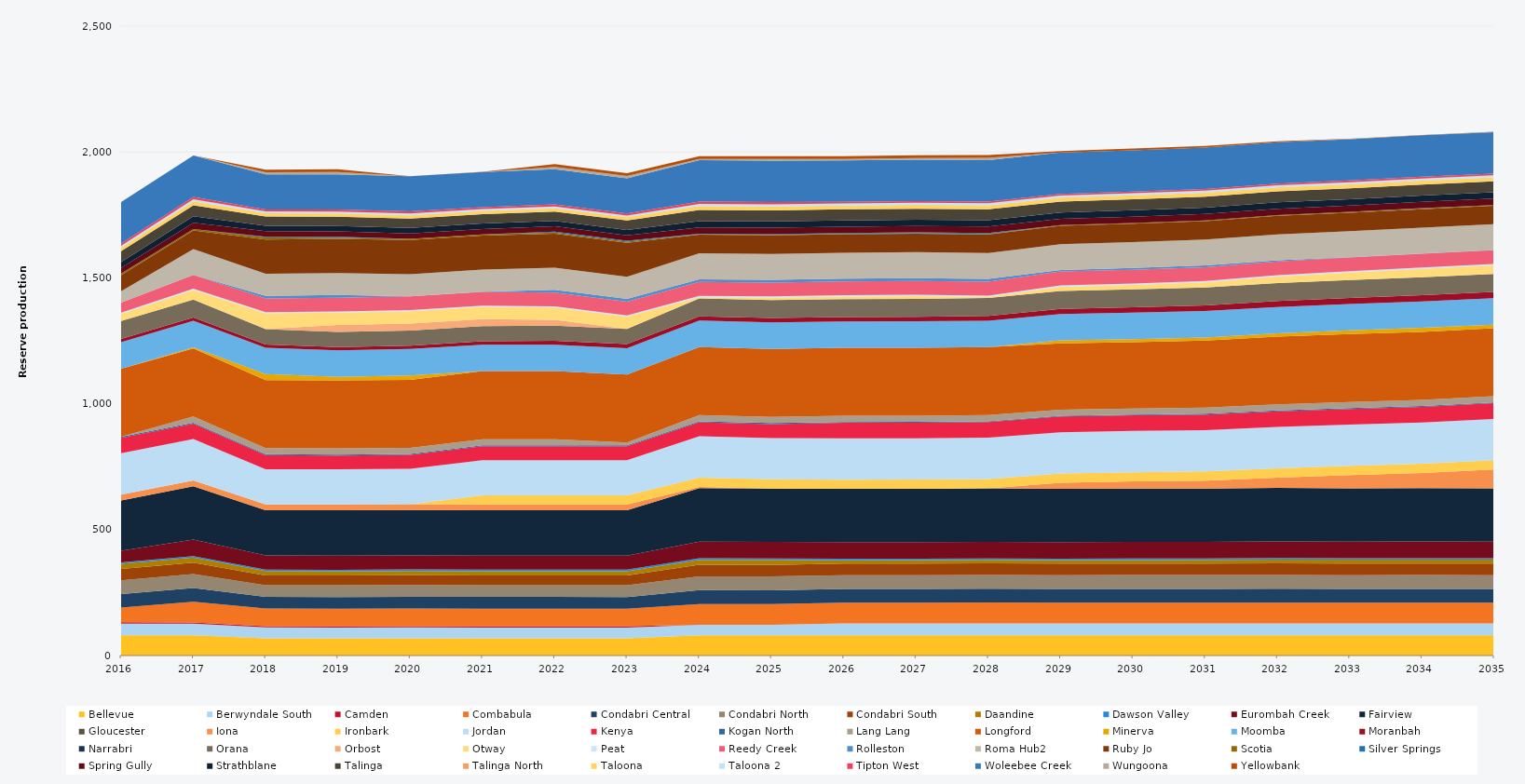
| Category | Bellevue | Berwyndale South | Camden | Combabula | Condabri Central | Condabri North | Condabri South | Daandine | Dawson Valley | Eurombah Creek | Fairview | Gloucester | Iona | Ironbark | Jordan | Kenya | Kogan North | Lang Lang | Longford | Minerva | Moomba | Moranbah | Narrabri | Orana | Orbost | Otway | Peat | Reedy Creek | Rolleston | Roma Hub2 | Ruby Jo | Scotia | Silver Springs | Spring Gully | Strathblane | Talinga | Talinga North | Taloona | Taloona 2 | Tipton West | Woleebee Creek | Wungoona | Yellowbank |
|---|---|---|---|---|---|---|---|---|---|---|---|---|---|---|---|---|---|---|---|---|---|---|---|---|---|---|---|---|---|---|---|---|---|---|---|---|---|---|---|---|---|---|---|
| 2016 | 80.52 | 46.378 | 5 | 58.608 | 54.013 | 54.488 | 44.939 | 20.13 | 5.856 | 46.503 | 199.247 | 0 | 23.12 | 0 | 164.7 | 61.402 | 4.392 | 0 | 270 | 0 | 105 | 12.867 | 0 | 71.092 | 0 | 28.323 | 5.49 | 39.406 | 0 | 45.298 | 64.114 | 6.001 | 0 | 22.72 | 23.178 | 43.205 | 0 | 13.509 | 7.577 | 9.516 | 164.7 | 0 | 0 |
| 2017 | 80.3 | 46.254 | 5 | 82.125 | 54.75 | 54.75 | 45.625 | 20.075 | 5.84 | 65.7 | 211.7 | 0 | 23.12 | 0 | 164.25 | 60.961 | 4.38 | 24.455 | 270 | 5.142 | 105 | 12.873 | 0 | 71.175 | 0 | 38 | 5.475 | 54.75 | 0 | 102.93 | 73.702 | 5.652 | 0 | 25.185 | 25.185 | 43.8 | 0 | 15.33 | 8.395 | 9.49 | 164.25 | 0 | 0 |
| 2018 | 68.255 | 43.435 | 5 | 69.806 | 46.538 | 46.538 | 38.781 | 17.064 | 5.84 | 55.845 | 179.945 | 0 | 23.12 | 0 | 139.612 | 55.845 | 3.723 | 24.455 | 270 | 23.725 | 105 | 13.04 | 0 | 60.499 | 1.143 | 61.725 | 4.654 | 54.75 | 10.41 | 87.49 | 135.659 | 8.582 | 3.149 | 21.407 | 21.407 | 37.23 | 0 | 13.031 | 7.136 | 8.066 | 139.612 | 8.046 | 10.279 |
| 2019 | 68.255 | 42.865 | 5 | 69.806 | 46.538 | 46.538 | 38.781 | 17.064 | 5.84 | 55.845 | 179.945 | 0 | 23.12 | 0 | 139.612 | 55.386 | 3.723 | 24.455 | 270 | 14.204 | 105 | 12.81 | 0 | 60.499 | 27.28 | 48.95 | 4.654 | 54.75 | 10.95 | 87.49 | 135.454 | 4.429 | 3.723 | 21.407 | 21.407 | 37.23 | 0 | 13.03 | 7.136 | 8.066 | 139.612 | 9.308 | 10.95 |
| 2020 | 68.442 | 43.001 | 5 | 69.998 | 46.665 | 46.665 | 38.887 | 17.111 | 5.856 | 55.998 | 180.438 | 0 | 23.12 | 0 | 139.995 | 55.509 | 3.733 | 24.522 | 270 | 17.679 | 105 | 12.781 | 0 | 60.664 | 27.45 | 48.95 | 4.666 | 54.9 | 0 | 87.73 | 135.722 | 4.584 | 0 | 21.466 | 21.466 | 37.332 | 0 | 13.066 | 7.155 | 8.089 | 139.995 | 0 | 0 |
| 2021 | 68.255 | 43.061 | 5 | 69.806 | 46.538 | 46.538 | 38.781 | 17.064 | 5.84 | 55.845 | 179.945 | 0 | 23.12 | 36.5 | 139.612 | 55.291 | 3.723 | 24.455 | 270 | 0 | 105 | 13.533 | 0 | 60.499 | 27.375 | 48.95 | 4.654 | 54.75 | 1.117 | 87.49 | 135.37 | 4.614 | 0 | 21.407 | 21.407 | 37.23 | 0 | 13.031 | 7.136 | 8.066 | 139.612 | 0 | 0.883 |
| 2022 | 68.255 | 43.089 | 5 | 69.806 | 46.538 | 46.538 | 38.781 | 17.064 | 5.84 | 55.845 | 179.945 | 0 | 23.12 | 36.5 | 139.612 | 55.25 | 3.723 | 24.455 | 270 | 0 | 105 | 15.298 | 0 | 60.499 | 23.234 | 48.95 | 4.654 | 54.75 | 10.95 | 87.49 | 135.285 | 4.262 | 3.723 | 21.407 | 21.407 | 37.23 | 0 | 13.031 | 7.136 | 8.066 | 139.612 | 9.308 | 10.95 |
| 2023 | 68.255 | 42.895 | 5 | 69.806 | 46.538 | 46.538 | 38.781 | 17.064 | 5.84 | 55.845 | 179.945 | 0 | 23.12 | 36.5 | 139.612 | 55.3 | 3.723 | 10.85 | 270 | 0 | 105 | 16.264 | 0 | 60.499 | 0 | 48.95 | 4.654 | 54.75 | 10.95 | 87.49 | 135.258 | 4.479 | 3.723 | 21.407 | 21.407 | 37.23 | 0 | 13.031 | 7.136 | 8.066 | 139.612 | 9.308 | 10.95 |
| 2024 | 80.52 | 41.843 | 0 | 82.35 | 54.9 | 54.9 | 45.75 | 20.13 | 5.856 | 65.88 | 212.28 | 0 | 5.3 | 36.6 | 164.7 | 55.116 | 4.392 | 24.522 | 270 | 0 | 105 | 16.79 | 0 | 71.37 | 0 | 4.941 | 5.49 | 54.9 | 10.98 | 103.212 | 73.713 | 1.867 | 1.843 | 25.254 | 25.254 | 43.92 | 0 | 15.372 | 8.418 | 9.516 | 164.7 | 4.332 | 10.98 |
| 2025 | 80.3 | 42.141 | 0 | 82.125 | 54.75 | 54.75 | 45.625 | 20.075 | 5.84 | 65.7 | 211.7 | 0 | 0 | 36.5 | 164.25 | 55.445 | 4.38 | 24.455 | 270 | 0 | 105 | 17.268 | 0 | 71.175 | 0 | 9.717 | 5.475 | 54.75 | 10.95 | 102.93 | 73.498 | 2.165 | 2.739 | 25.185 | 25.185 | 43.8 | 0 | 15.33 | 8.395 | 9.49 | 164.25 | 6.99 | 10.95 |
| 2026 | 80.3 | 47.26 | 0 | 82.125 | 54.75 | 54.75 | 45.625 | 13.627 | 5.84 | 65.7 | 211.7 | 0 | 0 | 36.5 | 164.25 | 62.238 | 2.982 | 24.455 | 270 | 0 | 105 | 17.518 | 0 | 71.175 | 0 | 10.011 | 5.475 | 54.75 | 10.95 | 102.93 | 73.455 | 2.063 | 2.433 | 25.185 | 25.185 | 43.8 | 0 | 15.33 | 8.395 | 6.232 | 164.25 | 5.992 | 10.95 |
| 2027 | 80.3 | 47.33 | 0 | 82.125 | 54.75 | 54.75 | 45.625 | 13.986 | 5.84 | 65.7 | 211.7 | 0 | 0 | 36.5 | 164.25 | 62.153 | 2.898 | 24.455 | 270 | 0 | 105 | 18.14 | 0 | 71.175 | 0 | 11.104 | 5.475 | 54.75 | 10.95 | 102.93 | 73.411 | 2.224 | 2.968 | 25.185 | 25.185 | 43.8 | 0 | 15.33 | 8.395 | 6.247 | 164.25 | 7.23 | 10.95 |
| 2028 | 80.52 | 47.494 | 0 | 82.35 | 54.9 | 54.9 | 45.75 | 13.938 | 5.856 | 65.88 | 212.28 | 0 | 0 | 36.6 | 164.7 | 62.283 | 2.931 | 24.522 | 270 | 0 | 105 | 18.99 | 0 | 71.37 | 0 | 4.035 | 5.49 | 54.9 | 10.98 | 103.212 | 73.537 | 2.336 | 3.609 | 25.254 | 25.254 | 43.92 | 0 | 15.372 | 8.418 | 6.601 | 164.7 | 9.039 | 10.98 |
| 2029 | 80.3 | 47.22 | 0 | 82.125 | 54.75 | 54.75 | 45.625 | 13.877 | 5.84 | 65.7 | 211.7 | 0 | 24.319 | 36.5 | 164.25 | 62.279 | 2.963 | 24.455 | 263.38 | 11.658 | 105 | 20.344 | 0 | 71.175 | 0 | 16.623 | 5.475 | 54.75 | 5.56 | 102.93 | 73.323 | 2.267 | 0.029 | 25.185 | 25.185 | 43.8 | 0 | 15.33 | 8.395 | 6.513 | 164.25 | 0.06 | 5.352 |
| 2030 | 80.3 | 47.66 | 0 | 82.125 | 54.75 | 54.75 | 45.625 | 14.232 | 5.84 | 65.7 | 211.7 | 0 | 28.44 | 36.5 | 164.25 | 61.84 | 2.956 | 24.455 | 263.006 | 12.316 | 105 | 21.608 | 0 | 71.175 | 0 | 17.71 | 5.475 | 54.75 | 7 | 102.93 | 73.279 | 2.649 | 0.039 | 25.185 | 25.185 | 43.8 | 0 | 15.33 | 8.395 | 6.413 | 164.25 | 0.119 | 7.121 |
| 2031 | 80.3 | 47.7 | 0 | 82.125 | 54.75 | 54.75 | 45.625 | 14.59 | 5.84 | 65.7 | 211.7 | 0 | 31.521 | 36.5 | 164.25 | 61.795 | 3.244 | 24.455 | 265.64 | 12.665 | 105 | 22.555 | 0 | 71.175 | 0 | 20.084 | 5.475 | 54.75 | 7.144 | 102.93 | 73.235 | 2.929 | 0.015 | 25.185 | 25.185 | 43.8 | 0 | 15.33 | 8.395 | 6.343 | 164.25 | 0.06 | 7.173 |
| 2032 | 80.52 | 47.395 | 0 | 82.35 | 54.9 | 54.9 | 45.75 | 15.556 | 5.856 | 65.88 | 212.28 | 0 | 41.07 | 36.6 | 164.7 | 62.394 | 3.067 | 24.522 | 269.157 | 12.373 | 105 | 23.473 | 0 | 71.37 | 0 | 26.2 | 5.49 | 54.9 | 3.847 | 103.212 | 73.361 | 3.195 | 0.035 | 25.254 | 25.254 | 43.92 | 0 | 15.372 | 8.418 | 6.647 | 164.7 | 0.06 | 3.781 |
| 2033 | 80.3 | 47.38 | 0 | 82.125 | 54.75 | 54.75 | 45.625 | 15.99 | 5.84 | 65.7 | 211.7 | 0 | 52.433 | 36.5 | 164.25 | 62.108 | 3.251 | 24.455 | 270 | 14.006 | 105 | 23.984 | 0 | 71.175 | 0 | 29.484 | 5.475 | 54.75 | 1.145 | 102.93 | 73.147 | 3.525 | 0.046 | 25.185 | 25.185 | 43.8 | 0 | 15.33 | 8.395 | 7.051 | 164.25 | 0.109 | 1.091 |
| 2034 | 80.3 | 47.59 | 0 | 82.125 | 54.75 | 54.75 | 45.625 | 15.922 | 5.84 | 65.7 | 211.7 | 0 | 60.853 | 36.5 | 164.25 | 61.9 | 3.303 | 24.455 | 270 | 15.797 | 105 | 24.559 | 0 | 71.175 | 0 | 33.72 | 5.475 | 54.75 | 0.701 | 102.93 | 73.103 | 3.708 | 0.096 | 25.185 | 25.185 | 43.8 | 0 | 15.33 | 8.395 | 7.253 | 164.25 | 0.183 | 0.738 |
| 2035 | 80.3 | 47.22 | 0 | 82.125 | 54.75 | 54.75 | 45.625 | 16.11 | 5.84 | 65.7 | 211.7 | 0 | 74.971 | 36.5 | 164.25 | 62.28 | 3.38 | 24.455 | 270 | 14.242 | 105 | 24.812 | 0 | 71.175 | 0 | 34.157 | 5.475 | 54.75 | 0.967 | 102.93 | 72.753 | 3.192 | 0.19 | 25.185 | 25.185 | 43.8 | 0 | 15.33 | 8.395 | 6.904 | 164.25 | 0.408 | 0.974 |